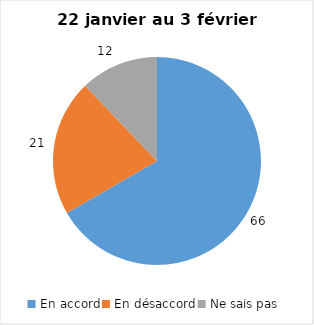
| Category | Series 0 |
|---|---|
| En accord | 66 |
| En désaccord | 21 |
| Ne sais pas | 12 |